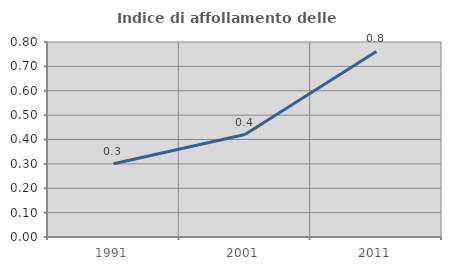
| Category | Indice di affollamento delle abitazioni  |
|---|---|
| 1991.0 | 0.3 |
| 2001.0 | 0.42 |
| 2011.0 | 0.761 |